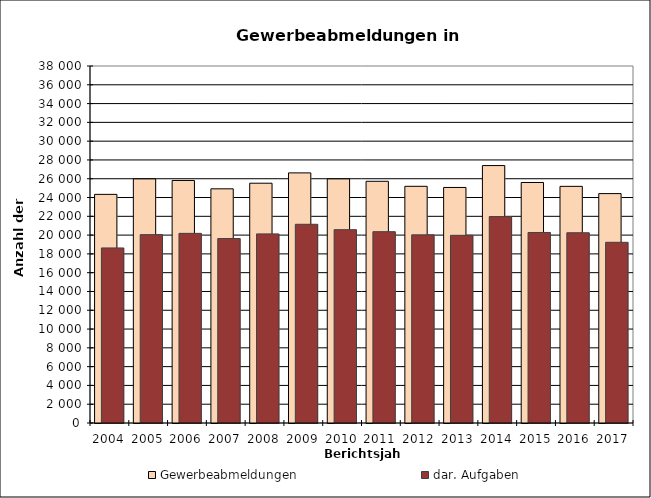
| Category | Gewerbeabmeldungen | dar. Aufgaben |
|---|---|---|
| 2004.0 | 24336 | 18633 |
| 2005.0 | 25984 | 20051 |
| 2006.0 | 25816 | 20185 |
| 2007.0 | 24926 | 19635 |
| 2008.0 | 25523 | 20128 |
| 2009.0 | 26623 | 21151 |
| 2010.0 | 25984 | 20578 |
| 2011.0 | 25729 | 20364 |
| 2012.0 | 25195 | 20027 |
| 2013.0 | 25071 | 19975 |
| 2014.0 | 27402 | 21971 |
| 2015.0 | 25601 | 20280 |
| 2016.0 | 25189 | 20252 |
| 2017.0 | 24417 | 19234 |